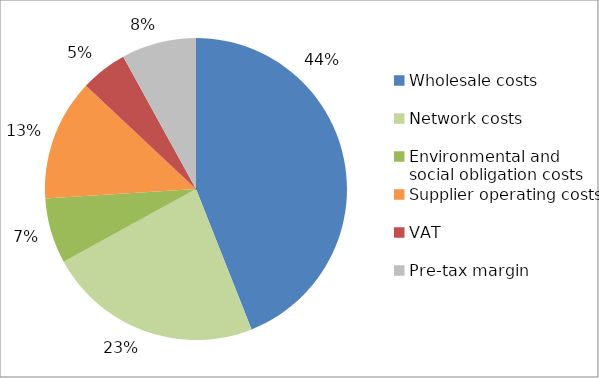
| Category | Series 0 |
|---|---|
| Wholesale costs | 0.44 |
| Network costs | 0.23 |
| Environmental and social obligation costs | 0.07 |
| Supplier operating costs | 0.13 |
| VAT | 0.05 |
| Pre-tax margin | 0.08 |